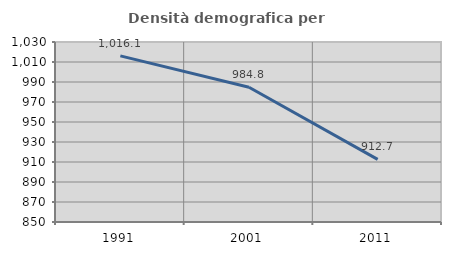
| Category | Densità demografica |
|---|---|
| 1991.0 | 1016.134 |
| 2001.0 | 984.783 |
| 2011.0 | 912.652 |